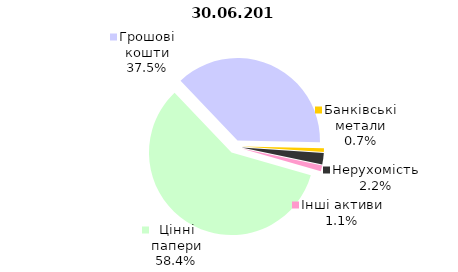
| Category | Всього |
|---|---|
| Цінні папери | 738.954 |
| Грошові кошти | 473.767 |
| Банківські метали | 9.132 |
| Нерухомість | 28.393 |
| Інші активи | 14.359 |